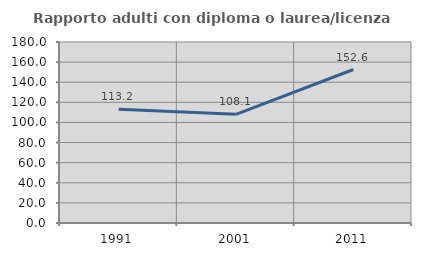
| Category | Rapporto adulti con diploma o laurea/licenza media  |
|---|---|
| 1991.0 | 113.235 |
| 2001.0 | 108.065 |
| 2011.0 | 152.632 |